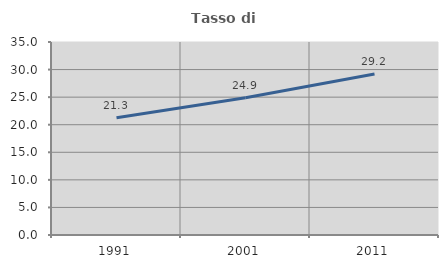
| Category | Tasso di occupazione   |
|---|---|
| 1991.0 | 21.28 |
| 2001.0 | 24.9 |
| 2011.0 | 29.202 |